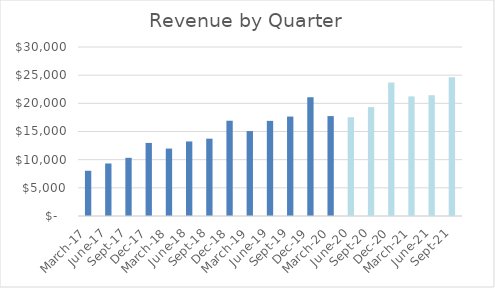
| Category | Series 0 |
|---|---|
| March-17 | 8032 |
| June-17 | 9321 |
| Sept-17 | 10328 |
| Dec-17 | 12972 |
| March-18 | 11966 |
| June-18 | 13231 |
| Sept-18 | 13727 |
| Dec-18 | 16914 |
| March-19 | 15077 |
| June-19 | 16886 |
| Sept-19 | 17652 |
| Dec-19 | 21082 |
| March-20 | 17737 |
| June-20 | 17533.281 |
| Sept-20 | 19335.892 |
| Dec-20 | 23692.95 |
| March-21 | 21234.841 |
| June-21 | 21447.044 |
| Sept-21 | 24619.66 |